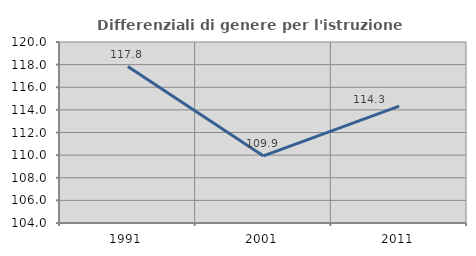
| Category | Differenziali di genere per l'istruzione superiore |
|---|---|
| 1991.0 | 117.826 |
| 2001.0 | 109.929 |
| 2011.0 | 114.333 |